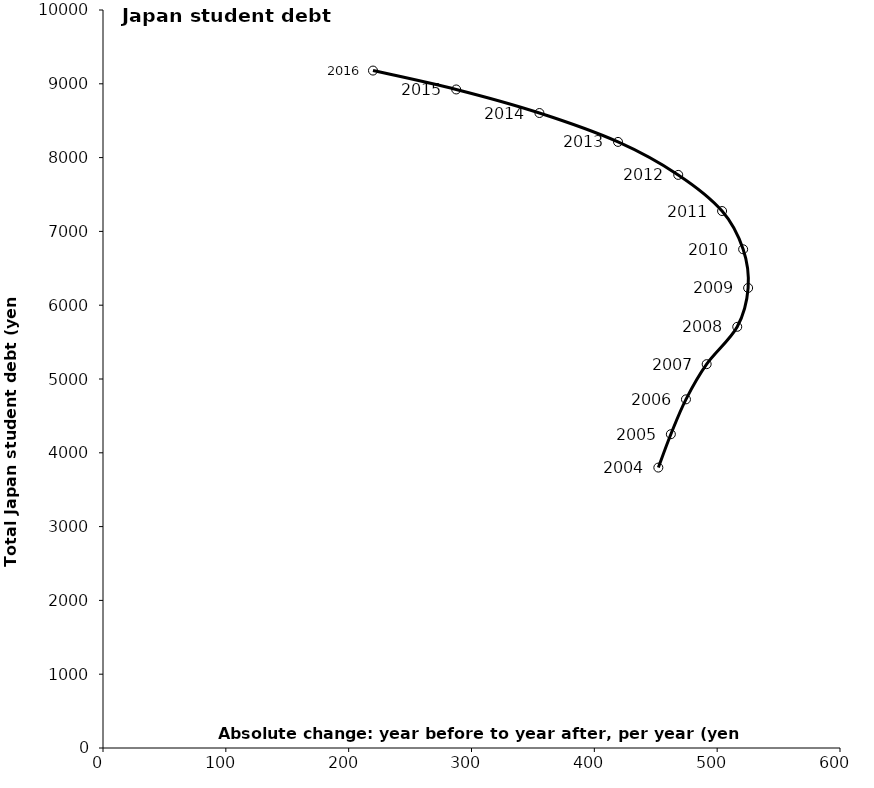
| Category | Series 0 |
|---|---|
| 452.10000000000036 | 3799.7 |
| 462.3000000000002 | 4251.8 |
| 474.5999999999999 | 4724.3 |
| 491.4499999999998 | 5201 |
| 516.3499999999999 | 5707.2 |
| 525.2000000000003 | 6233.7 |
| 521.1500000000001 | 6757.6 |
| 504.0 | 7276 |
| 468.3000000000002 | 7765.6 |
| 419.3000000000002 | 8212.6 |
| 355.3000000000002 | 8604.2 |
| 287.5499999999993 | 8923.2 |
| 219.79999999999836 | 9179.3 |